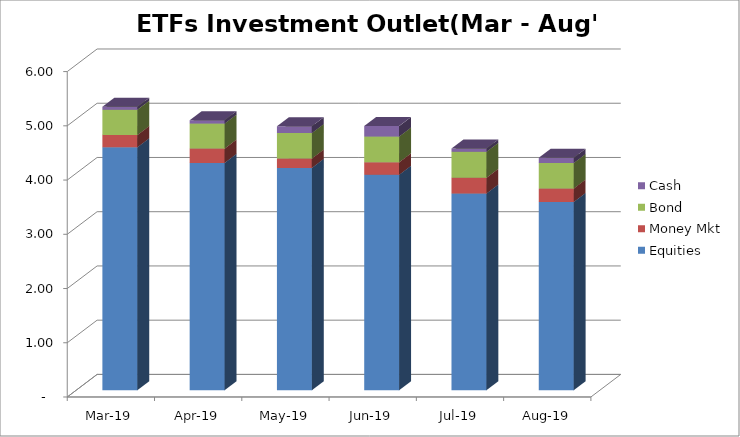
| Category | Equities | Money Mkt | Bond | Cash |
|---|---|---|---|---|
| 2019-03-01 | 4479173842.33 | 225580048.82 | 467336909.16 | 53276506 |
| 2019-04-01 | 4191729465.72 | 263468874.03 | 460460354.97 | 63029070.21 |
| 2019-05-01 | 4099532871.38 | 172710343.84 | 468805980.48 | 125439511.89 |
| 2019-06-01 | 3972247152.89 | 229299651.51 | 475230363.37 | 192975483.86 |
| 2019-07-01 | 3626542879.42 | 289258119.71 | 479657875.89 | 61469802.89 |
| 2019-08-01 | 3470989519.07 | 248600081.58 | 468259884.71 | 98425220.25 |